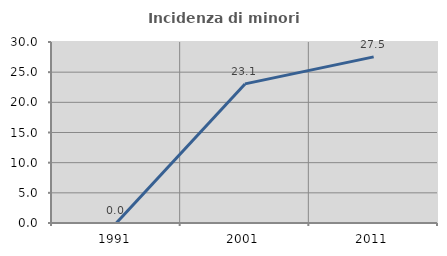
| Category | Incidenza di minori stranieri |
|---|---|
| 1991.0 | 0 |
| 2001.0 | 23.055 |
| 2011.0 | 27.535 |